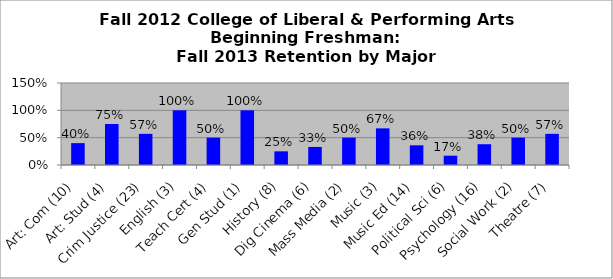
| Category | Series 0 |
|---|---|
| Art: Com (10) | 0.4 |
| Art: Stud (4) | 0.75 |
| Crim Justice (23) | 0.57 |
| English (3) | 1 |
| Teach Cert (4) | 0.5 |
| Gen Stud (1) | 1 |
| History (8) | 0.25 |
| Dig Cinema (6) | 0.33 |
| Mass Media (2) | 0.5 |
| Music (3) | 0.67 |
| Music Ed (14) | 0.36 |
| Political Sci (6) | 0.17 |
| Psychology (16) | 0.38 |
| Social Work (2) | 0.5 |
| Theatre (7) | 0.57 |